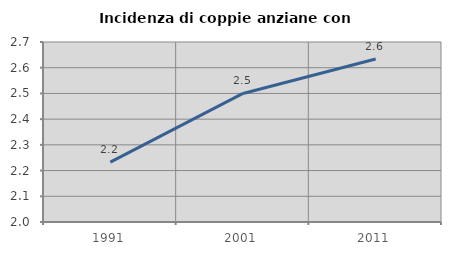
| Category | Incidenza di coppie anziane con figli |
|---|---|
| 1991.0 | 2.233 |
| 2001.0 | 2.5 |
| 2011.0 | 2.634 |